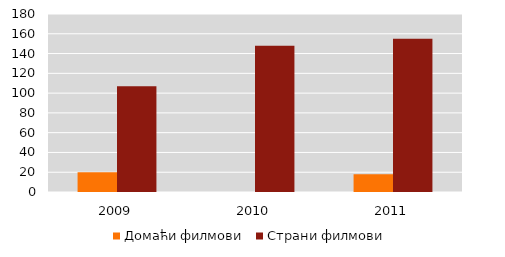
| Category | Домаћи филмови | Страни филмови |
|---|---|---|
| 2009.0 | 20 | 107 |
| 2010.0 | 0 | 148 |
| 2011.0 | 18 | 155 |